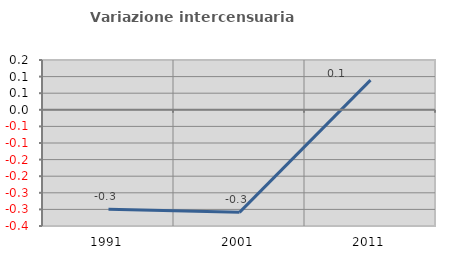
| Category | Variazione intercensuaria annua |
|---|---|
| 1991.0 | -0.3 |
| 2001.0 | -0.309 |
| 2011.0 | 0.089 |